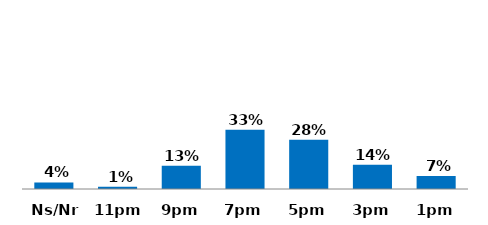
| Category | Series 0 |
|---|---|
| 1pm | 0.073 |
| 3pm | 0.137 |
| 5pm | 0.277 |
| 7pm | 0.333 |
| 9pm | 0.13 |
| 11pm | 0.013 |
| Ns/Nr | 0.037 |